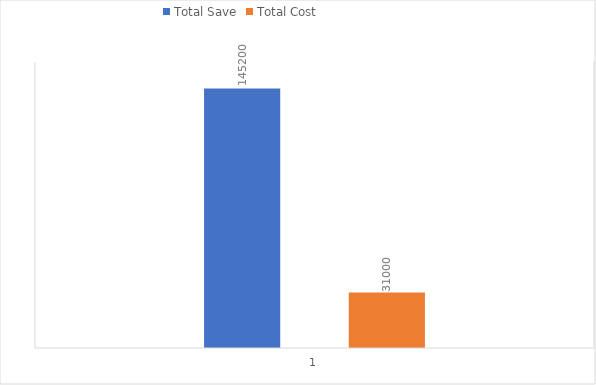
| Category | Total Save | Total Cost |
|---|---|---|
| 0 | 145200 | 31000 |